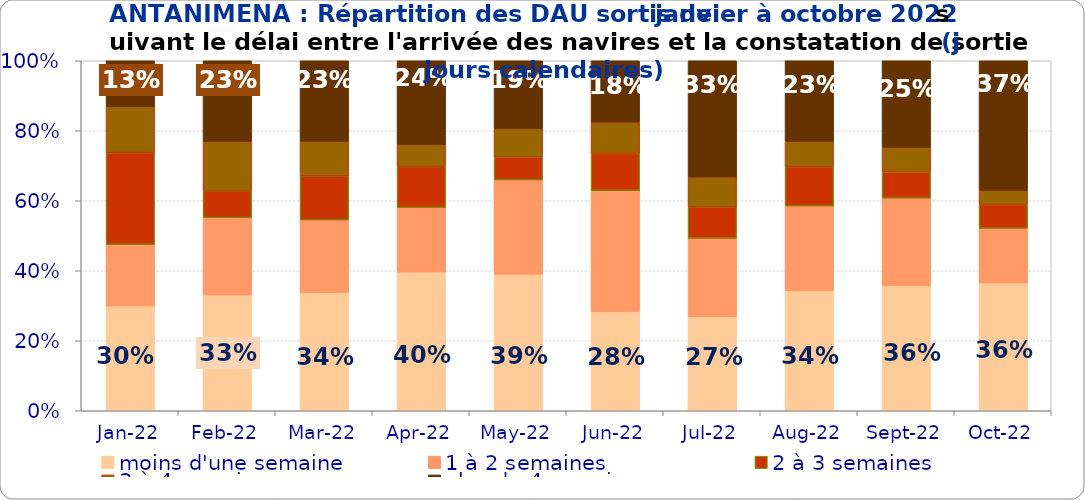
| Category | moins d'une semaine | 1 à 2 semaines | 2 à 3 semaines | 3 à 4 semaines | plus de 4 semaines |
|---|---|---|---|---|---|
| 2022-01-01 | 0.299 | 0.176 | 0.262 | 0.132 | 0.131 |
| 2022-02-01 | 0.331 | 0.221 | 0.075 | 0.143 | 0.23 |
| 2022-03-01 | 0.337 | 0.208 | 0.126 | 0.099 | 0.23 |
| 2022-04-01 | 0.396 | 0.185 | 0.117 | 0.063 | 0.239 |
| 2022-05-01 | 0.39 | 0.269 | 0.065 | 0.082 | 0.193 |
| 2022-06-01 | 0.284 | 0.346 | 0.106 | 0.09 | 0.175 |
| 2022-07-01 | 0.268 | 0.225 | 0.088 | 0.087 | 0.332 |
| 2022-08-01 | 0.343 | 0.242 | 0.112 | 0.072 | 0.23 |
| 2022-09-01 | 0.357 | 0.25 | 0.075 | 0.07 | 0.247 |
| 2022-10-01 | 0.365 | 0.156 | 0.068 | 0.041 | 0.37 |